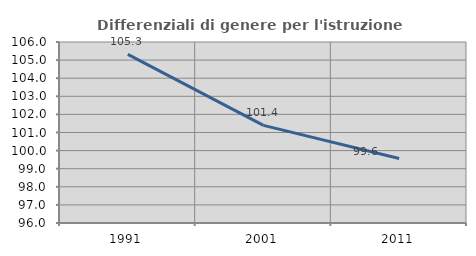
| Category | Differenziali di genere per l'istruzione superiore |
|---|---|
| 1991.0 | 105.318 |
| 2001.0 | 101.394 |
| 2011.0 | 99.566 |